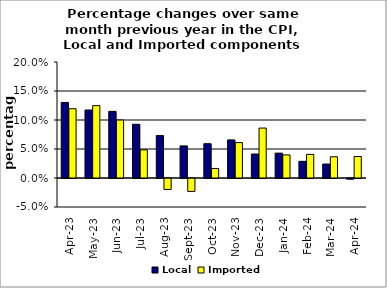
| Category | Local | Imported |
|---|---|---|
| 2023-04-01 | 0.13 | 0.119 |
| 2023-05-01 | 0.117 | 0.125 |
| 2023-06-01 | 0.115 | 0.1 |
| 2023-07-01 | 0.093 | 0.049 |
| 2023-08-01 | 0.073 | -0.019 |
| 2023-09-01 | 0.055 | -0.022 |
| 2023-10-01 | 0.059 | 0.016 |
| 2023-11-01 | 0.066 | 0.061 |
| 2023-12-01 | 0.041 | 0.086 |
| 2024-01-01 | 0.043 | 0.04 |
| 2024-02-01 | 0.029 | 0.041 |
| 2024-03-01 | 0.024 | 0.037 |
| 2024-04-01 | -0.001 | 0.037 |